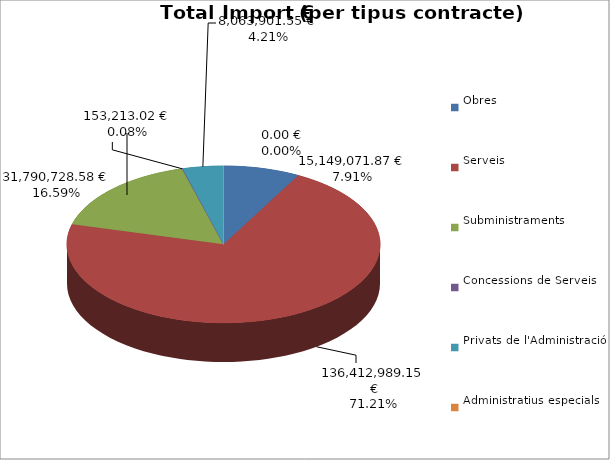
| Category | Total preu
(amb IVA) |
|---|---|
| Obres | 15149071.87 |
| Serveis | 136412989.15 |
| Subministraments | 31790728.58 |
| Concessions de Serveis | 153213.02 |
| Privats de l'Administració | 8063901.55 |
| Administratius especials | 0 |